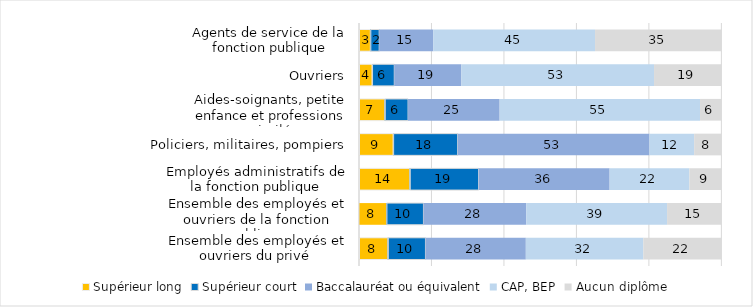
| Category | Supérieur long | Supérieur court | Baccalauréat ou équivalent | CAP, BEP | Aucun diplôme |
|---|---|---|---|---|---|
| Agents de service de la fonction publique | 3.122 | 2.446 | 14.913 | 44.653 | 34.867 |
| Ouvriers | 3.596 | 6.136 | 18.509 | 53.179 | 18.58 |
| Aides-soignants, petite enfance et professions assimilées | 7.106 | 6.432 | 25.269 | 55.302 | 5.891 |
| Policiers, militaires, pompiers | 9.414 | 17.822 | 52.91 | 12.343 | 7.51 |
| Employés administratifs de la fonction publique | 14.008 | 18.992 | 36.157 | 22.017 | 8.825 |
| Ensemble des employés et ouvriers de la fonction publique | 7.564 | 10.221 | 28.361 | 38.87 | 14.984 |
| Ensemble des employés et ouvriers du privé  | 7.949 | 10.389 | 27.699 | 32.425 | 21.538 |